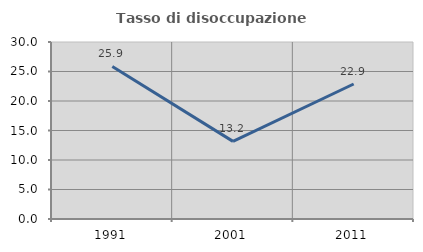
| Category | Tasso di disoccupazione giovanile  |
|---|---|
| 1991.0 | 25.859 |
| 2001.0 | 13.158 |
| 2011.0 | 22.879 |